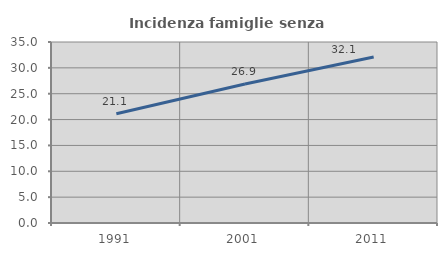
| Category | Incidenza famiglie senza nuclei |
|---|---|
| 1991.0 | 21.123 |
| 2001.0 | 26.882 |
| 2011.0 | 32.105 |